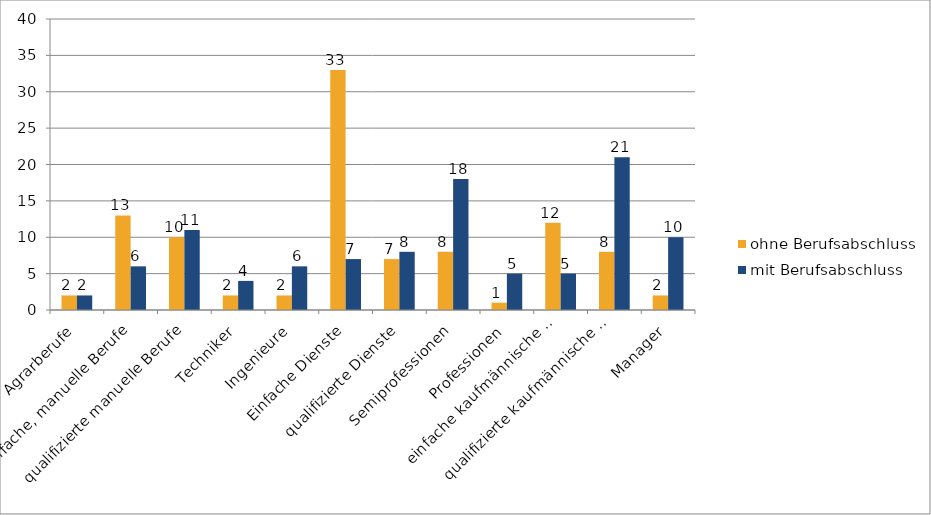
| Category | ohne Berufsabschluss | mit Berufsabschluss |
|---|---|---|
| Agrarberufe | 2 | 2 |
| einfache, manuelle Berufe | 13 | 6 |
| qualifizierte manuelle Berufe | 10 | 11 |
| Techniker | 2 | 4 |
| Ingenieure | 2 | 6 |
| Einfache Dienste | 33 | 7 |
| qualifizierte Dienste | 7 | 8 |
| Semiprofessionen | 8 | 18 |
| Professionen | 1 | 5 |
| einfache kaufmännische 
und Verwaltungsberufe | 12 | 5 |
| qualifizierte kaufmännische 
und Verwaltungsberufe | 8 | 21 |
| Manager | 2 | 10 |